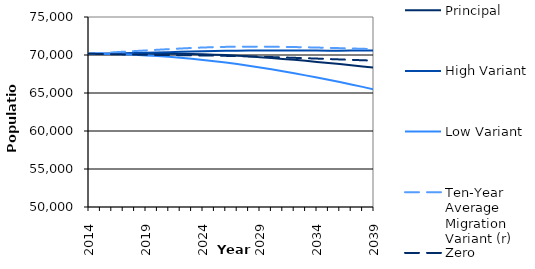
| Category | Principal | High Variant | Low Variant | Ten-Year Average Migration Variant (r) | Zero Migration Variant |
|---|---|---|---|---|---|
| 2014.0 | 70169 | 70169 | 70169 | 70169 | 70169 |
| 2015.0 | 70165.47 | 70165.47 | 70165.47 | 70248.154 | 70131.08 |
| 2016.0 | 70170.04 | 70194.998 | 70128.994 | 70336.935 | 70102.761 |
| 2017.0 | 70176.044 | 70229.016 | 70082.825 | 70428.643 | 70079.915 |
| 2018.0 | 70174.98 | 70261.091 | 70019.591 | 70514.611 | 70053.725 |
| 2019.0 | 70173.824 | 70297.557 | 69946.131 | 70601.836 | 70031.408 |
| 2020.0 | 70169.169 | 70335.125 | 69858.367 | 70687.045 | 70010.761 |
| 2021.0 | 70161.58 | 70375.658 | 69756.884 | 70770.866 | 69994.191 |
| 2022.0 | 70149.202 | 70416.148 | 69639.953 | 70851.423 | 69979.668 |
| 2023.0 | 70128.534 | 70454.669 | 69507.107 | 70925.112 | 69963.487 |
| 2024.0 | 70093.784 | 70488.919 | 69355.079 | 70985.887 | 69940.884 |
| 2025.0 | 70045.411 | 70521.341 | 69186.079 | 71034.084 | 69914.715 |
| 2026.0 | 69983.675 | 70550.025 | 69002.038 | 71069.705 | 69885.919 |
| 2027.0 | 69907.707 | 70570.712 | 68802.415 | 71091.696 | 69853.24 |
| 2028.0 | 69819.01 | 70583.867 | 68587.779 | 71101.54 | 69816.598 |
| 2029.0 | 69718.371 | 70590.239 | 68358.233 | 71099.987 | 69774.824 |
| 2030.0 | 69607.062 | 70591.237 | 68114.952 | 71088.363 | 69728.339 |
| 2031.0 | 69487.6 | 70588.779 | 67859.86 | 71069.212 | 69679.037 |
| 2032.0 | 69361.501 | 70585.165 | 67594.725 | 71044.154 | 69628.815 |
| 2033.0 | 69230.779 | 70582.299 | 67320.663 | 71015.375 | 69579.827 |
| 2034.0 | 69092.885 | 70577.919 | 67034.537 | 70980.422 | 69526.977 |
| 2035.0 | 68950.119 | 70575.09 | 66739.084 | 70941.842 | 69472.214 |
| 2036.0 | 68803.002 | 70575.493 | 66435.03 | 70900.388 | 69416.436 |
| 2037.0 | 68654.069 | 70582.405 | 66125.087 | 70858.85 | 69362.366 |
| 2038.0 | 68501.707 | 70592.212 | 65804.569 | 70815.771 | 69308.752 |
| 2039.0 | 68348.411 | 70607.982 | 65476.86 | 70773.864 | 69258.345 |